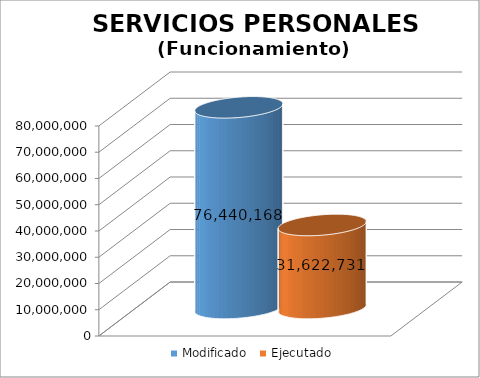
| Category | Modificado | Ejecutado |
|---|---|---|
| 0 | 76440168 | 31622731.1 |